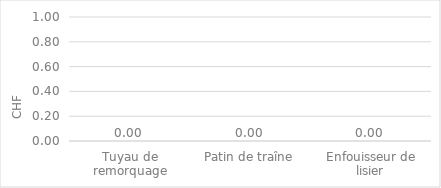
| Category | Series 0 |
|---|---|
| Tuyau de remorquage | 0 |
| Patin de traîne | 0 |
| Enfouisseur de lisier | 0 |